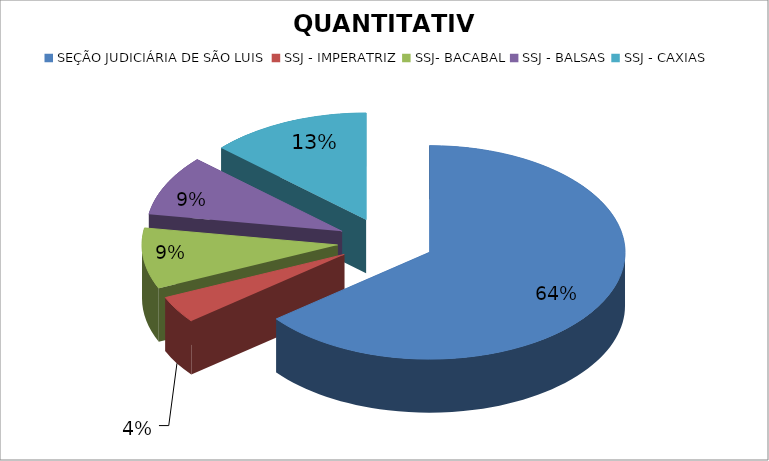
| Category | QUANTITATIVO |
|---|---|
| SEÇÃO JUDICIÁRIA DE SÃO LUIS | 63 |
| SSJ - IMPERATRIZ | 4 |
| SSJ- BACABAL | 9 |
| SSJ - BALSAS | 9 |
| SSJ - CAXIAS | 13 |